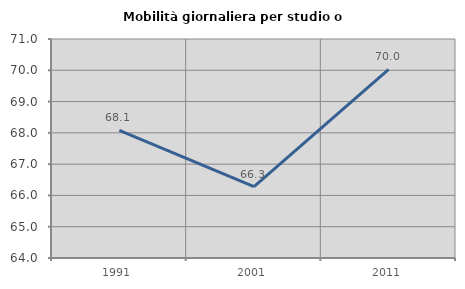
| Category | Mobilità giornaliera per studio o lavoro |
|---|---|
| 1991.0 | 68.076 |
| 2001.0 | 66.278 |
| 2011.0 | 70.026 |